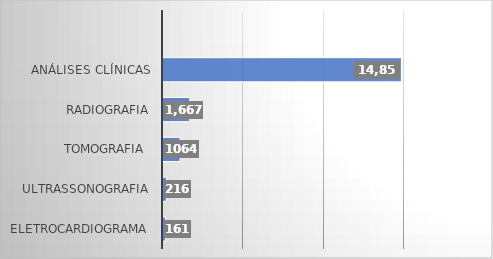
| Category | Series 0 |
|---|---|
| ELETROCARDIOGRAMA | 161 |
| ULTRASSONOGRAFIA | 216 |
| TOMOGRAFIA  | 1064 |
| RADIOGRAFIA | 1667 |
| ANÁLISES CLÍNICAS | 14853 |